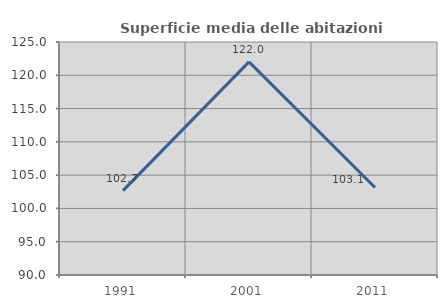
| Category | Superficie media delle abitazioni occupate |
|---|---|
| 1991.0 | 102.674 |
| 2001.0 | 122.009 |
| 2011.0 | 103.147 |